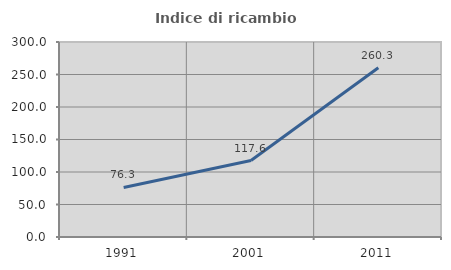
| Category | Indice di ricambio occupazionale  |
|---|---|
| 1991.0 | 76.271 |
| 2001.0 | 117.588 |
| 2011.0 | 260.317 |